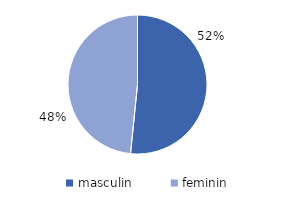
| Category | Series 0 |
|---|---|
| masculin | 51.6 |
| feminin | 48.4 |